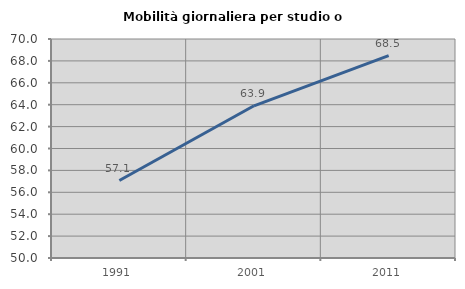
| Category | Mobilità giornaliera per studio o lavoro |
|---|---|
| 1991.0 | 57.075 |
| 2001.0 | 63.901 |
| 2011.0 | 68.479 |